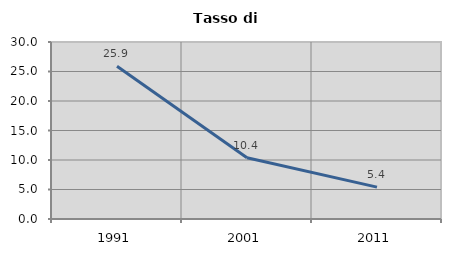
| Category | Tasso di disoccupazione   |
|---|---|
| 1991.0 | 25.875 |
| 2001.0 | 10.377 |
| 2011.0 | 5.4 |